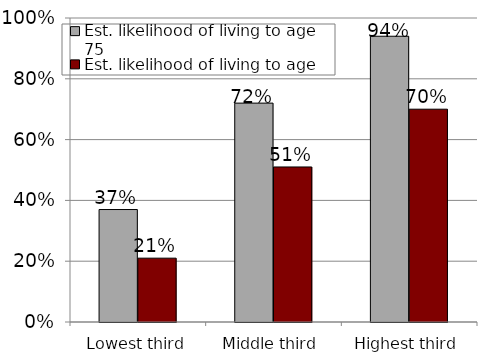
| Category | Est. likelihood of living to age 75 | Est. likelihood of living to age 85 |
|---|---|---|
| Lowest third | 0.37 | 0.21 |
| Middle third | 0.72 | 0.51 |
| Highest third | 0.94 | 0.7 |